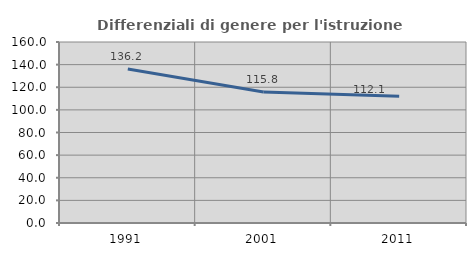
| Category | Differenziali di genere per l'istruzione superiore |
|---|---|
| 1991.0 | 136.207 |
| 2001.0 | 115.752 |
| 2011.0 | 112.084 |